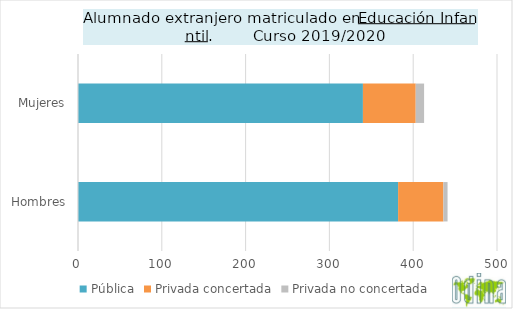
| Category | Pública | Privada concertada | Privada no concertada |
|---|---|---|---|
| Hombres | 382 | 54 | 5 |
| Mujeres | 340 | 63 | 10 |